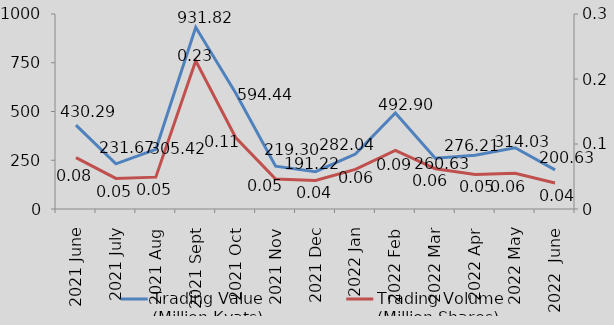
| Category | Trading Value
(Million Kyats) |
|---|---|
| 2021 June | 430.286 |
| 2021 July | 231.666 |
| 2021 Aug | 305.422 |
| 2021 Sept | 931.818 |
| 2021 Oct | 594.439 |
| 2021 Nov | 219.298 |
| 2021 Dec | 191.219 |
| 2022 Jan | 282.043 |
| 2022 Feb | 492.903 |
| 2022 Mar | 260.634 |
| 2022 Apr | 276.211 |
| 2022 May | 314.031 |
| 2022  June | 200.631 |